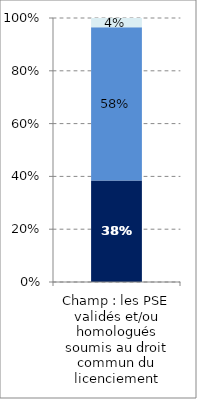
| Category | Homologation | Validation | Accord mixte (validation-homologation) |
|---|---|---|---|
| Champ : les PSE validés et/ou homologués soumis au droit commun du licenciement | 0.384 | 0.58 | 0.035 |